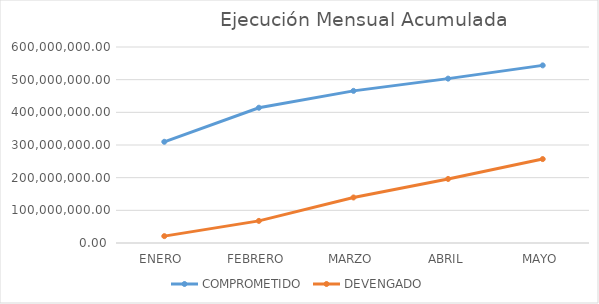
| Category | COMPROMETIDO | DEVENGADO |
|---|---|---|
| ENERO  | 309828241.26 | 21038537.98 |
| FEBRERO | 414079504.28 | 67669543.95 |
| MARZO | 465698372.67 | 139356027.07 |
| ABRIL | 503176063.85 | 196072686.83 |
| MAYO | 543736537.81 | 256937805.69 |